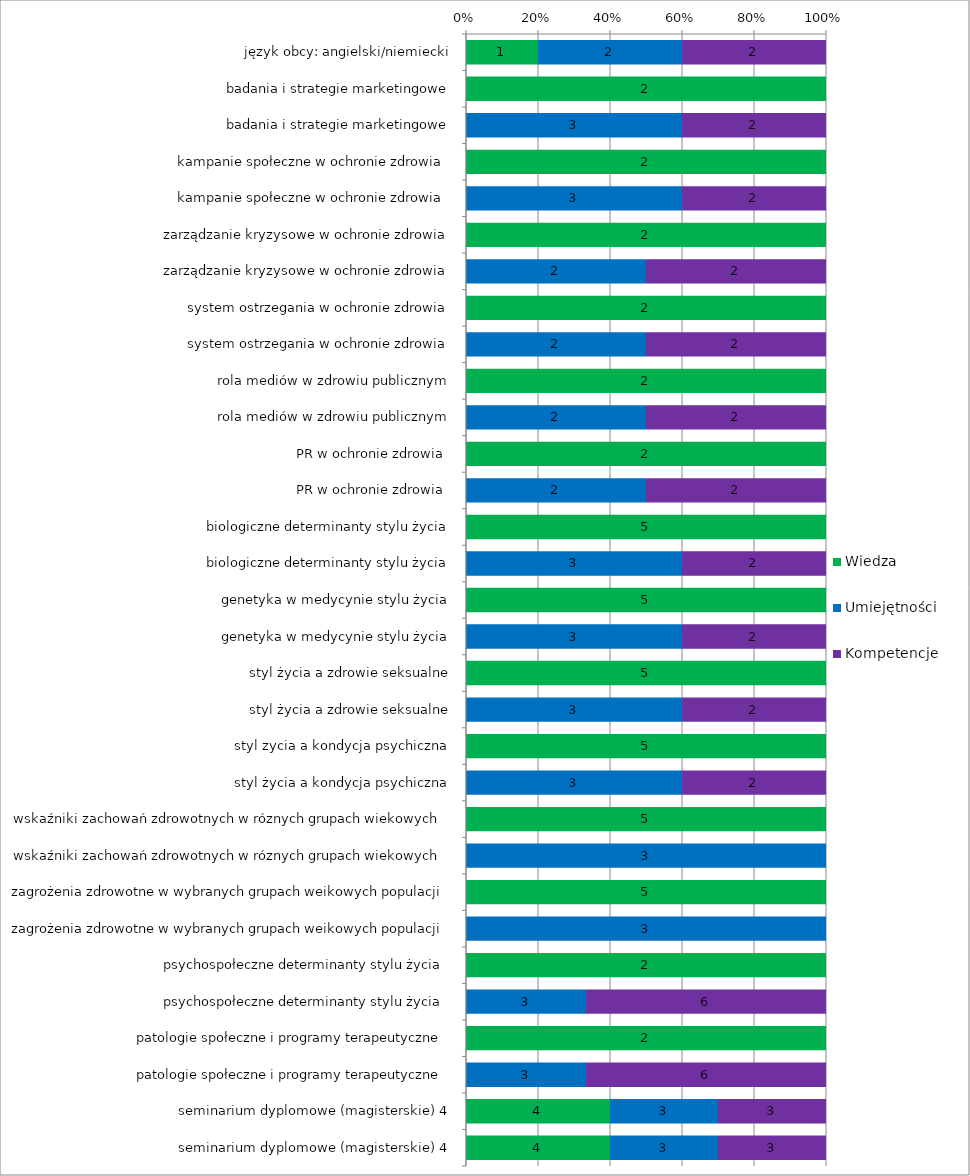
| Category | Wiedza | Umiejętności | Kompetencje |
|---|---|---|---|
| język obcy: angielski/niemiecki | 1 | 2 | 2 |
| badania i strategie marketingowe | 2 | 0 | 0 |
| badania i strategie marketingowe | 0 | 3 | 2 |
| kampanie społeczne w ochronie zdrowia  | 2 | 0 | 0 |
| kampanie społeczne w ochronie zdrowia  | 0 | 3 | 2 |
| zarządzanie kryzysowe w ochronie zdrowia | 2 | 0 | 0 |
| zarządzanie kryzysowe w ochronie zdrowia | 0 | 2 | 2 |
| system ostrzegania w ochronie zdrowia | 2 | 0 | 0 |
| system ostrzegania w ochronie zdrowia | 0 | 2 | 2 |
| rola mediów w zdrowiu publicznym | 2 | 0 | 0 |
| rola mediów w zdrowiu publicznym | 0 | 2 | 2 |
| PR w ochronie zdrowia  | 2 | 0 | 0 |
| PR w ochronie zdrowia  | 0 | 2 | 2 |
| biologiczne determinanty stylu życia | 5 | 0 | 0 |
| biologiczne determinanty stylu życia | 0 | 3 | 2 |
| genetyka w medycynie stylu życia | 5 | 0 | 0 |
| genetyka w medycynie stylu życia | 0 | 3 | 2 |
| styl życia a zdrowie seksualne | 5 | 0 | 0 |
| styl życia a zdrowie seksualne | 0 | 3 | 2 |
| styl zycia a kondycja psychiczna | 5 | 0 | 0 |
| styl życia a kondycja psychiczna | 0 | 3 | 2 |
| wskaźniki zachowań zdrowotnych w róznych grupach wiekowych  | 5 | 0 | 0 |
| wskaźniki zachowań zdrowotnych w róznych grupach wiekowych  | 0 | 3 | 0 |
| zagrożenia zdrowotne w wybranych grupach weikowych populacji | 5 | 0 | 0 |
| zagrożenia zdrowotne w wybranych grupach weikowych populacji | 0 | 3 | 0 |
| psychospołeczne determinanty stylu życia  | 2 | 0 | 0 |
| psychospołeczne determinanty stylu życia  | 0 | 3 | 6 |
| patologie społeczne i programy terapeutyczne  | 2 | 0 | 0 |
| patologie społeczne i programy terapeutyczne  | 0 | 3 | 6 |
| seminarium dyplomowe (magisterskie) 4 | 4 | 3 | 3 |
| seminarium dyplomowe (magisterskie) 4 | 4 | 3 | 3 |